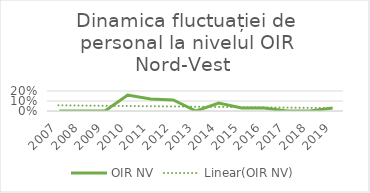
| Category | OIR NV |
|---|---|
| 2007.0 | 0 |
| 2008.0 | 0 |
| 2009.0 | 0 |
| 2010.0 | 0.16 |
| 2011.0 | 0.12 |
| 2012.0 | 0.11 |
| 2013.0 | 0 |
| 2014.0 | 0.08 |
| 2015.0 | 0.03 |
| 2016.0 | 0.03 |
| 2017.0 | 0 |
| 2018.0 | 0 |
| 2019.0 | 0.03 |